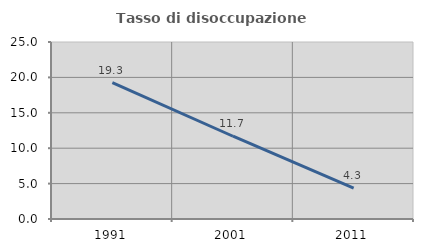
| Category | Tasso di disoccupazione giovanile  |
|---|---|
| 1991.0 | 19.255 |
| 2001.0 | 11.688 |
| 2011.0 | 4.348 |